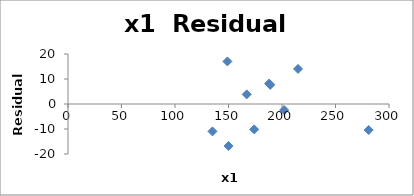
| Category | Series 0 |
|---|---|
| 174.0 | -10.163 |
| 281.0 | -10.412 |
| 189.0 | 7.655 |
| 202.0 | -2.412 |
| 149.0 | 17.025 |
| 188.0 | 8.18 |
| 215.0 | 14.019 |
| 150.0 | -16.781 |
| 167.0 | 3.848 |
| 135.0 | -10.958 |